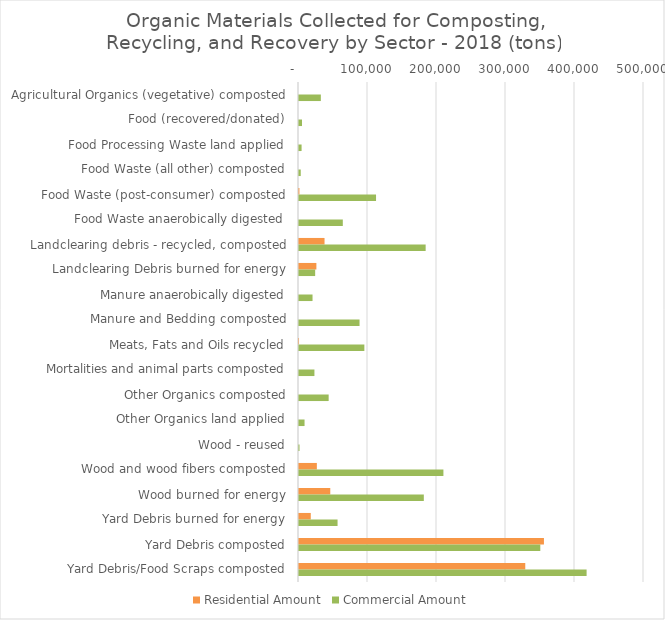
| Category | Residential Amount | Commercial Amount |
|---|---|---|
| Agricultural Organics (vegetative) composted | 0 | 31659.81 |
| Food (recovered/donated) | 0 | 4308.24 |
| Food Processing Waste land applied | 0 | 3740.489 |
| Food Waste (all other) composted | 0 | 2518.16 |
| Food Waste (post-consumer) composted | 615.14 | 111640.06 |
| Food Waste anaerobically digested | 0 | 63490.315 |
| Landclearing debris - recycled, composted | 37008.22 | 183553.96 |
| Landclearing Debris burned for energy | 25203.37 | 23433.84 |
| Manure anaerobically digested | 0 | 19610.272 |
| Manure and Bedding composted | 0 | 87743.85 |
| Meats, Fats and Oils recycled | 28.75 | 94727.534 |
| Mortalities and animal parts composted | 0 | 22360.9 |
| Other Organics composted | 0 | 42983.27 |
| Other Organics land applied | 0 | 8037.26 |
| Wood - reused | 0 | 737.94 |
| Wood and wood fibers composted | 25882.3 | 209292.98 |
| Wood burned for energy | 45329.45 | 180900.797 |
| Yard Debris burned for energy | 17063.96 | 55884.14 |
| Yard Debris composted | 354987.03 | 349714.04 |
| Yard Debris/Food Scraps composted | 327923.29 | 416813.37 |